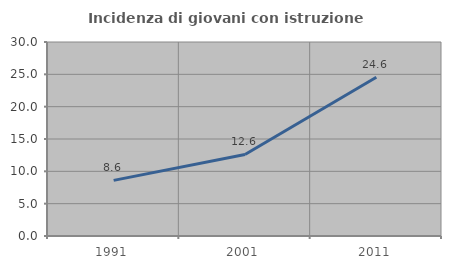
| Category | Incidenza di giovani con istruzione universitaria |
|---|---|
| 1991.0 | 8.599 |
| 2001.0 | 12.607 |
| 2011.0 | 24.561 |